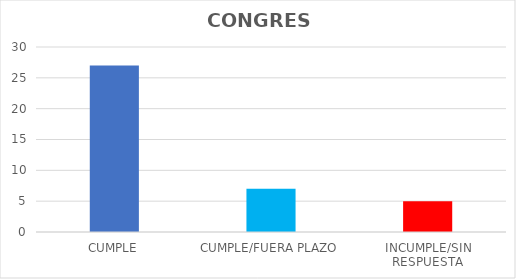
| Category | TOTAL |
|---|---|
| CUMPLE | 27 |
| CUMPLE/FUERA PLAZO | 7 |
| INCUMPLE/SIN RESPUESTA | 5 |